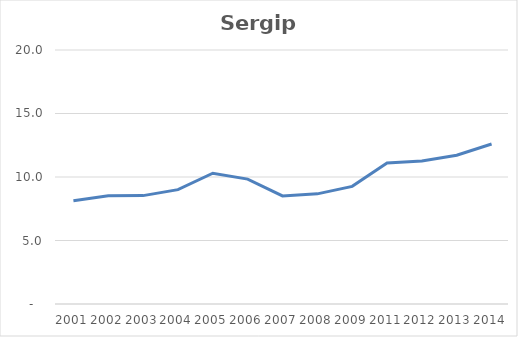
| Category | Total |
|---|---|
| 2001.0 | 8.126 |
| 2002.0 | 8.527 |
| 2003.0 | 8.535 |
| 2004.0 | 9.006 |
| 2005.0 | 10.295 |
| 2006.0 | 9.836 |
| 2007.0 | 8.514 |
| 2008.0 | 8.672 |
| 2009.0 | 9.263 |
| 2011.0 | 11.095 |
| 2012.0 | 11.252 |
| 2013.0 | 11.71 |
| 2014.0 | 12.597 |